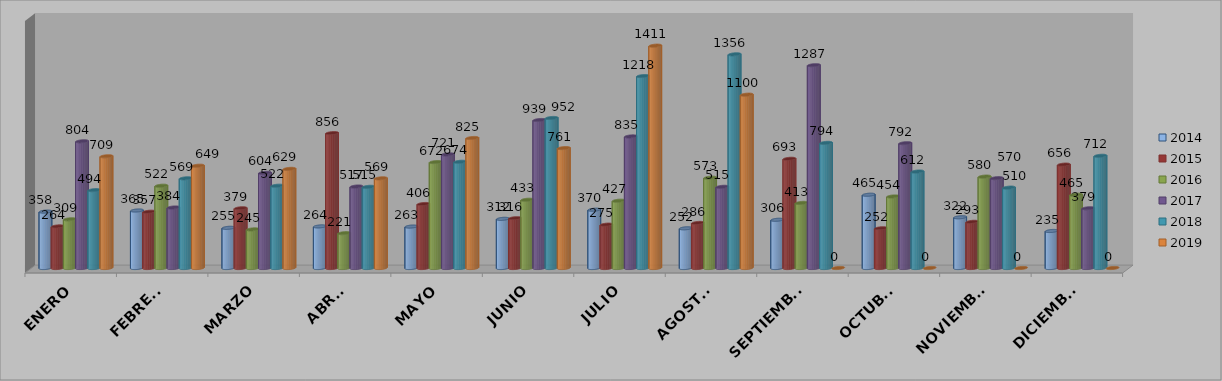
| Category | 2014 | 2015 | 2016 | 2017 | 2018 | 2019 |
|---|---|---|---|---|---|---|
| ENERO | 358 | 264 | 309 | 804 | 494 | 709 |
| FEBRERO | 365 | 357 | 522 | 384 | 569 | 649 |
| MARZO | 255 | 379 | 245 | 604 | 522 | 629 |
| ABRIL | 264 | 856 | 221 | 517 | 515 | 569 |
| MAYO | 263 | 406 | 672 | 721 | 674 | 825 |
| JUNIO | 312 | 316 | 433 | 939 | 952 | 761 |
| JULIO | 370 | 275 | 427 | 835 | 1218 | 1411 |
| AGOSTO | 252 | 286 | 573 | 515 | 1356 | 1100 |
| SEPTIEMBRE | 306 | 693 | 413 | 1287 | 794 | 0 |
| OCTUBRE | 465 | 252 | 454 | 792 | 612 | 0 |
| NOVIEMBRE | 322 | 293 | 580 | 570 | 510 | 0 |
| DICIEMBRE | 235 | 656 | 465 | 379 | 712 | 0 |